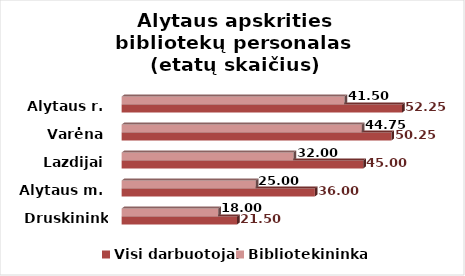
| Category | Visi darbuotojai | Bibliotekininkai |
|---|---|---|
| Druskininkai | 21.5 | 18 |
| Alytaus m. | 36 | 25 |
| Lazdijai | 45 | 32 |
| Varėna | 50.25 | 44.75 |
| Alytaus r. | 52.25 | 41.5 |